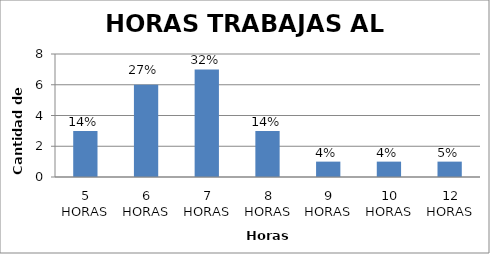
| Category | PERSONAS X HORAS |
|---|---|
| 5 HORAS | 3 |
| 6 HORAS | 6 |
| 7 HORAS | 7 |
| 8 HORAS | 3 |
| 9 HORAS | 1 |
| 10 HORAS | 1 |
| 12 HORAS | 1 |